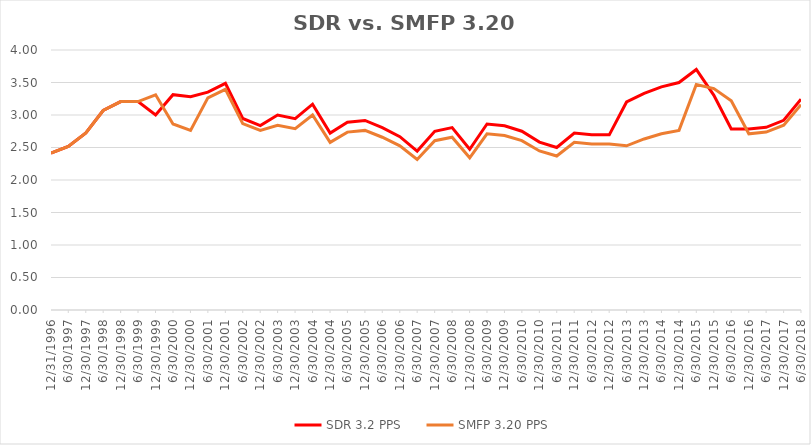
| Category | SDR 3.2 PPS | SMFP 3.20 PPS |
|---|---|---|
| 12/31/96 | 2.414 | 2.414 |
| 6/30/97 | 2.517 | 2.517 |
| 12/31/97 | 2.724 | 2.724 |
| 6/30/98 | 3.069 | 3.069 |
| 12/31/98 | 3.207 | 3.207 |
| 6/30/99 | 3.207 | 3.207 |
| 12/31/99 | 3 | 3.31 |
| 6/30/00 | 3.312 | 2.863 |
| 12/31/00 | 3.281 | 2.763 |
| 6/30/01 | 3.351 | 3.263 |
| 12/31/01 | 3.486 | 3.395 |
| 6/30/02 | 2.946 | 2.868 |
| 12/31/02 | 2.838 | 2.763 |
| 6/30/03 | 3 | 2.842 |
| 12/31/03 | 2.944 | 2.789 |
| 6/30/04 | 3.167 | 3 |
| 12/31/04 | 2.722 | 2.579 |
| 6/30/05 | 2.889 | 2.737 |
| 12/31/05 | 2.917 | 2.763 |
| 6/30/06 | 2.806 | 2.658 |
| 12/31/06 | 2.667 | 2.526 |
| 6/30/07 | 2.444 | 2.316 |
| 12/31/07 | 2.75 | 2.605 |
| 6/30/08 | 2.806 | 2.658 |
| 12/31/08 | 2.472 | 2.342 |
| 6/30/09 | 2.861 | 2.711 |
| 12/31/09 | 2.833 | 2.684 |
| 6/30/10 | 2.75 | 2.605 |
| 12/31/10 | 2.583 | 2.447 |
| 6/30/11 | 2.5 | 2.368 |
| 12/31/11 | 2.722 | 2.579 |
| 6/30/12 | 2.694 | 2.553 |
| 12/31/12 | 2.694 | 2.553 |
| 6/30/13 | 3.2 | 2.526 |
| 12/31/13 | 3.333 | 2.632 |
| 6/30/14 | 3.433 | 2.711 |
| 12/31/14 | 3.5 | 2.763 |
| 6/30/15 | 3.7 | 3.469 |
| 12/31/15 | 3.303 | 3.406 |
| 6/30/16 | 2.784 | 3.219 |
| 12/31/16 | 2.784 | 2.711 |
| 6/30/17 | 2.811 | 2.737 |
| 12/31/17 | 2.919 | 2.842 |
| 6/30/18 | 3.243 | 3.158 |